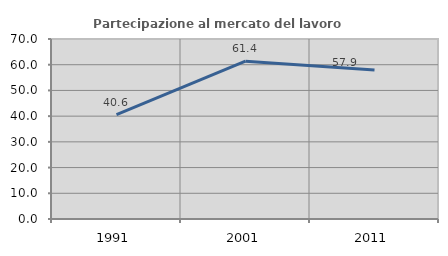
| Category | Partecipazione al mercato del lavoro  femminile |
|---|---|
| 1991.0 | 40.586 |
| 2001.0 | 61.372 |
| 2011.0 | 57.947 |